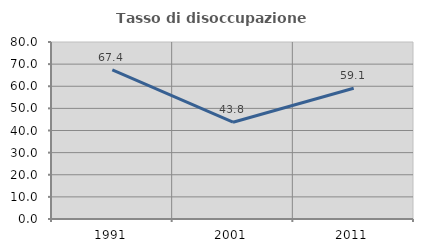
| Category | Tasso di disoccupazione giovanile  |
|---|---|
| 1991.0 | 67.442 |
| 2001.0 | 43.75 |
| 2011.0 | 59.091 |